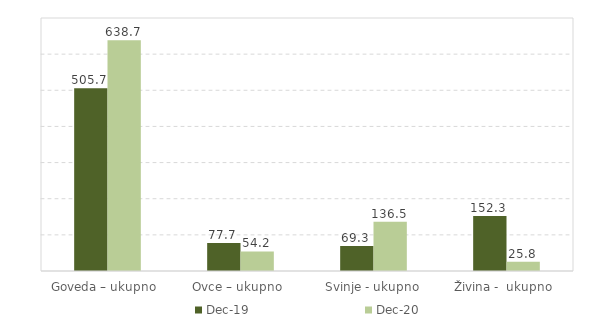
| Category | Dec-19 | Dec-20 |
|---|---|---|
| Goveda – ukupno  | 505.7 | 638.694 |
| Ovce – ukupno  | 77.7 | 54.231 |
| Svinje - ukupno | 69.3 | 136.532 |
| Živina -  ukupno  | 152.3 | 25.763 |